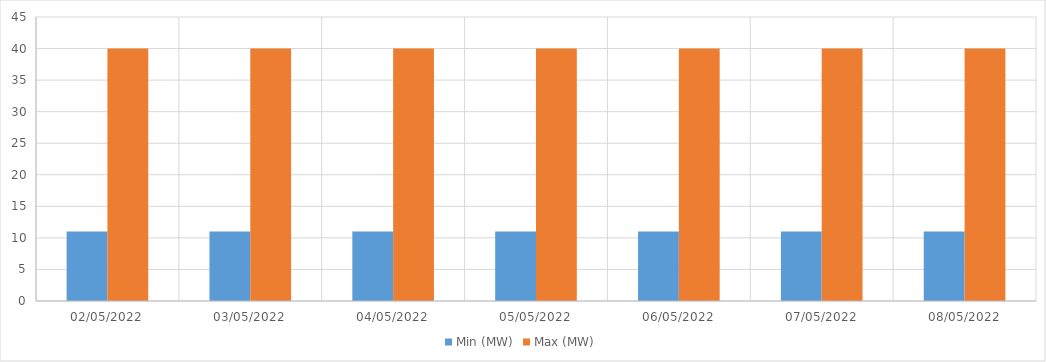
| Category | Min (MW) | Max (MW) |
|---|---|---|
| 02/05/2022 | 11 | 40 |
| 03/05/2022 | 11 | 40 |
| 04/05/2022 | 11 | 40 |
| 05/05/2022 | 11 | 40 |
| 06/05/2022 | 11 | 40 |
| 07/05/2022 | 11 | 40 |
| 08/05/2022 | 11 | 40 |